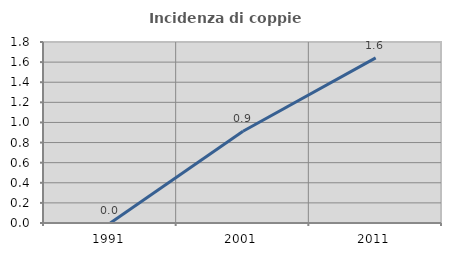
| Category | Incidenza di coppie miste |
|---|---|
| 1991.0 | 0 |
| 2001.0 | 0.913 |
| 2011.0 | 1.642 |